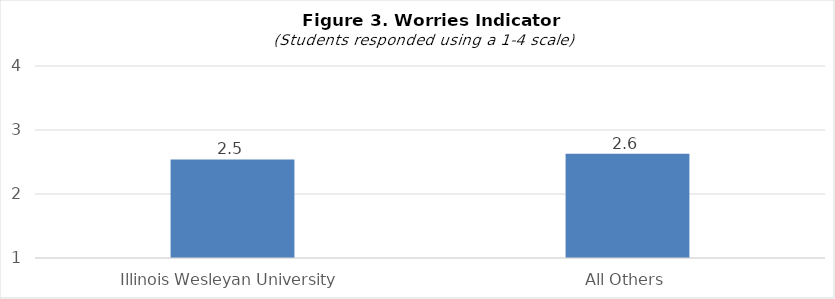
| Category | Series 0 |
|---|---|
| Illinois Wesleyan University | 2.54 |
| All Others | 2.63 |